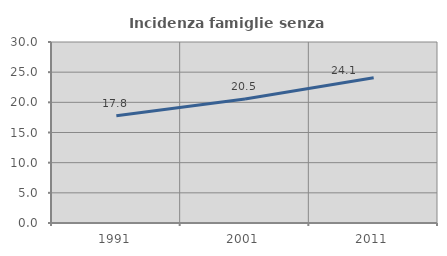
| Category | Incidenza famiglie senza nuclei |
|---|---|
| 1991.0 | 17.77 |
| 2001.0 | 20.543 |
| 2011.0 | 24.08 |